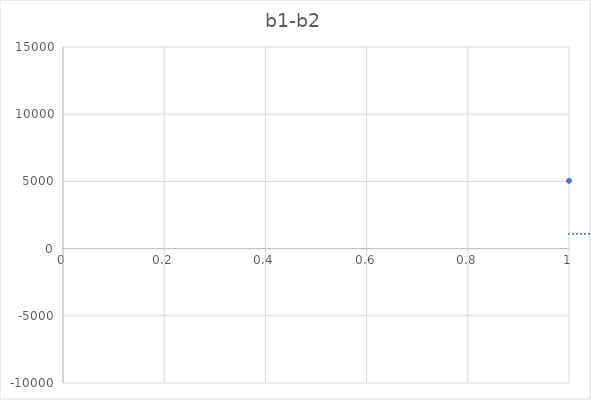
| Category | b1-b2 |
|---|---|
| 0 | 5046 |
| 1 | -1098 |
| 2 | 1888 |
| 3 | -3379 |
| 4 | 2950 |
| 5 | -5703 |
| 6 | 2308 |
| 7 | 645 |
| 8 | 4017 |
| 9 | 5165 |
| 10 | 6944 |
| 11 | 4979 |
| 12 | -1031 |
| 13 | -8 |
| 14 | -501 |
| 15 | -2913 |
| 16 | 5461 |
| 17 | -1440 |
| 18 | 7818 |
| 19 | 1304 |
| 20 | 4329 |
| 21 | 3226 |
| 22 | -1727 |
| 23 | 2951 |
| 24 | 1703 |
| 25 | 2592 |
| 26 | 1246 |
| 27 | 971 |
| 28 | 1352 |
| 29 | 4115 |
| 30 | -1150 |
| 31 | -33 |
| 32 | 1179 |
| 33 | 4400 |
| 34 | -115 |
| 35 | 6268 |
| 36 | 734 |
| 37 | 2362 |
| 38 | 390 |
| 39 | 1781 |
| 40 | 1096 |
| 41 | 992 |
| 42 | 3974 |
| 43 | -606 |
| 44 | 2962 |
| 45 | -2649 |
| 46 | 133 |
| 47 | 4928 |
| 48 | 1754 |
| 49 | 8312 |
| 50 | 202 |
| 51 | 1708 |
| 52 | 3781 |
| 53 | -1274 |
| 54 | -240 |
| 55 | -1375 |
| 56 | 4022 |
| 57 | 6196 |
| 58 | 246 |
| 59 | 2799 |
| 60 | 1679 |
| 61 | 1385 |
| 62 | -645 |
| 63 | -3844 |
| 64 | -443 |
| 65 | -817 |
| 66 | 3512 |
| 67 | 402 |
| 68 | 7057 |
| 69 | 3024 |
| 70 | 5490 |
| 71 | -2726 |
| 72 | 4408 |
| 73 | -4667 |
| 74 | 3391 |
| 75 | 8812 |
| 76 | 5095 |
| 77 | -2355 |
| 78 | -424 |
| 79 | -2337 |
| 80 | -2623 |
| 81 | 381 |
| 82 | 307 |
| 83 | 98 |
| 84 | 2617 |
| 85 | -641 |
| 86 | -1498 |
| 87 | -3541 |
| 88 | 1079 |
| 89 | 1274 |
| 90 | 50 |
| 91 | 2622 |
| 92 | -2165 |
| 93 | 237 |
| 94 | 2796 |
| 95 | -278 |
| 96 | 4050 |
| 97 | 1414 |
| 98 | -108 |
| 99 | -5784 |
| 100 | -342 |
| 101 | -642 |
| 102 | 4752 |
| 103 | 3940 |
| 104 | -3372 |
| 105 | -6662 |
| 106 | -6177 |
| 107 | -967 |
| 108 | 2720 |
| 109 | -981 |
| 110 | 2323 |
| 111 | -3326 |
| 112 | 5011 |
| 113 | 1351 |
| 114 | 4447 |
| 115 | 2330 |
| 116 | -3239 |
| 117 | -3088 |
| 118 | 3525 |
| 119 | -1557 |
| 120 | 9778 |
| 121 | -1571 |
| 122 | 594 |
| 123 | -958 |
| 124 | -3276 |
| 125 | 3785 |
| 126 | -3938 |
| 127 | 1567 |
| 128 | 2147 |
| 129 | 2217 |
| 130 | 8280 |
| 131 | 29 |
| 132 | -7578 |
| 133 | -287 |
| 134 | -530 |
| 135 | -3319 |
| 136 | -162 |
| 137 | 642 |
| 138 | 4774 |
| 139 | -770 |
| 140 | 3983 |
| 141 | 4176 |
| 142 | 4136 |
| 143 | 520 |
| 144 | -434 |
| 145 | 95 |
| 146 | 4437 |
| 147 | 3504 |
| 148 | -7777 |
| 149 | 4528 |
| 150 | -2681 |
| 151 | 622 |
| 152 | 2341 |
| 153 | 293 |
| 154 | 3095 |
| 155 | 1606 |
| 156 | 1910 |
| 157 | -139 |
| 158 | -2739 |
| 159 | 2819 |
| 160 | -453 |
| 161 | -2454 |
| 162 | -285 |
| 163 | 941 |
| 164 | -1987 |
| 165 | -4862 |
| 166 | 1473 |
| 167 | 3140 |
| 168 | -4927 |
| 169 | 613 |
| 170 | -707 |
| 171 | 426 |
| 172 | -500 |
| 173 | -6825 |
| 174 | -204 |
| 175 | 2145 |
| 176 | 3138 |
| 177 | 3703 |
| 178 | -1953 |
| 179 | 4610 |
| 180 | 2926 |
| 181 | 2949 |
| 182 | -1942 |
| 183 | 2670 |
| 184 | -790 |
| 185 | 3871 |
| 186 | 2225 |
| 187 | 2817 |
| 188 | 171 |
| 189 | 1292 |
| 190 | 322 |
| 191 | 4910 |
| 192 | -664 |
| 193 | 2448 |
| 194 | -251 |
| 195 | 4133 |
| 196 | 4810 |
| 197 | 2894 |
| 198 | -1531 |
| 199 | -5916 |
| 200 | -4877 |
| 201 | 2727 |
| 202 | -3543 |
| 203 | 3002 |
| 204 | 1977 |
| 205 | 1500 |
| 206 | 2833 |
| 207 | -3433 |
| 208 | -496 |
| 209 | 2333 |
| 210 | 6332 |
| 211 | 1812 |
| 212 | 6263 |
| 213 | 1147 |
| 214 | -490 |
| 215 | 5096 |
| 216 | 2529 |
| 217 | -1444 |
| 218 | 1879 |
| 219 | -682 |
| 220 | 3700 |
| 221 | 315 |
| 222 | -1312 |
| 223 | 114 |
| 224 | -3558 |
| 225 | -2374 |
| 226 | 186 |
| 227 | -3483 |
| 228 | 5096 |
| 229 | 32 |
| 230 | 712 |
| 231 | 3869 |
| 232 | 2360 |
| 233 | -936 |
| 234 | -2789 |
| 235 | -1942 |
| 236 | 1523 |
| 237 | 400 |
| 238 | 2756 |
| 239 | -1261 |
| 240 | 4991 |
| 241 | 707 |
| 242 | -1062 |
| 243 | -192 |
| 244 | -1189 |
| 245 | -1696 |
| 246 | 5495 |
| 247 | -756 |
| 248 | 1758 |
| 249 | -525 |
| 250 | 2868 |
| 251 | -973 |
| 252 | 592 |
| 253 | 2743 |
| 254 | 329 |
| 255 | 3449 |
| 256 | 4511 |
| 257 | -646 |
| 258 | 2814 |
| 259 | -200 |
| 260 | 12 |
| 261 | 847 |
| 262 | 4203 |
| 263 | 2598 |
| 264 | -3989 |
| 265 | -2206 |
| 266 | 149 |
| 267 | 3694 |
| 268 | 3136 |
| 269 | 6210 |
| 270 | -4008 |
| 271 | -1900 |
| 272 | 4908 |
| 273 | 1139 |
| 274 | -2200 |
| 275 | 1047 |
| 276 | 5500 |
| 277 | -242 |
| 278 | 1119 |
| 279 | 3453 |
| 280 | -2271 |
| 281 | 1846 |
| 282 | -1006 |
| 283 | 5724 |
| 284 | -2561 |
| 285 | -3274 |
| 286 | 4838 |
| 287 | 709 |
| 288 | 6122 |
| 289 | 1572 |
| 290 | 4374 |
| 291 | -4682 |
| 292 | 4131 |
| 293 | 5663 |
| 294 | 1174 |
| 295 | 3639 |
| 296 | 2303 |
| 297 | 372 |
| 298 | 4484 |
| 299 | 2623 |
| 300 | -1231 |
| 301 | 19 |
| 302 | -225 |
| 303 | 3380 |
| 304 | 3397 |
| 305 | 2841 |
| 306 | -1428 |
| 307 | 2499 |
| 308 | 3915 |
| 309 | 3606 |
| 310 | -535 |
| 311 | -776 |
| 312 | -6298 |
| 313 | -4312 |
| 314 | 4210 |
| 315 | 1215 |
| 316 | -1343 |
| 317 | 4842 |
| 318 | 1463 |
| 319 | 5425 |
| 320 | 4588 |
| 321 | -4786 |
| 322 | 733 |
| 323 | 1879 |
| 324 | -2631 |
| 325 | 3010 |
| 326 | 3888 |
| 327 | -2048 |
| 328 | -4411 |
| 329 | -449 |
| 330 | -2588 |
| 331 | 2522 |
| 332 | -2657 |
| 333 | 2009 |
| 334 | -117 |
| 335 | -2336 |
| 336 | -1282 |
| 337 | 4215 |
| 338 | 199 |
| 339 | -1689 |
| 340 | -3993 |
| 341 | 842 |
| 342 | 3845 |
| 343 | -2995 |
| 344 | 2449 |
| 345 | 11451 |
| 346 | 3603 |
| 347 | 4676 |
| 348 | 2648 |
| 349 | 1176 |
| 350 | 4630 |